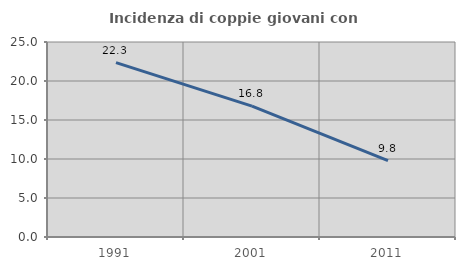
| Category | Incidenza di coppie giovani con figli |
|---|---|
| 1991.0 | 22.348 |
| 2001.0 | 16.776 |
| 2011.0 | 9.801 |